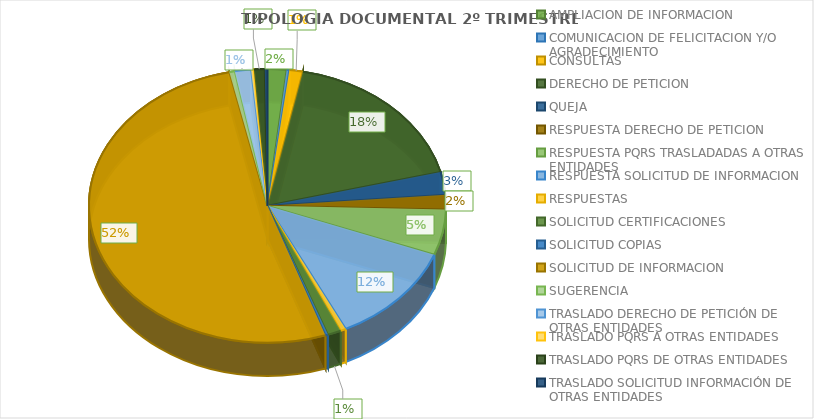
| Category | Series 0 |
|---|---|
| AMPLIACION DE INFORMACION | 7 |
| COMUNICACION DE FELICITACION Y/O AGRADECIMIENTO | 1 |
| CONSULTAS | 5 |
| DERECHO DE PETICION | 73 |
| QUEJA | 11 |
| RESPUESTA DERECHO DE PETICION | 7 |
| RESPUESTA PQRS TRASLADADAS A OTRAS ENTIDADES | 22 |
| RESPUESTA SOLICITUD DE INFORMACION | 49 |
| RESPUESTAS | 2 |
| SOLICITUD CERTIFICACIONES | 5 |
| SOLICITUD COPIAS | 1 |
| SOLICITUD DE INFORMACION | 212 |
| SUGERENCIA | 2 |
| TRASLADO DERECHO DE PETICIÓN DE OTRAS ENTIDADES | 6 |
| TRASLADO PQRS A OTRAS ENTIDADES | 1 |
| TRASLADO PQRS DE OTRAS ENTIDADES | 4 |
| TRASLADO SOLICITUD INFORMACIÓN DE OTRAS ENTIDADES | 1 |